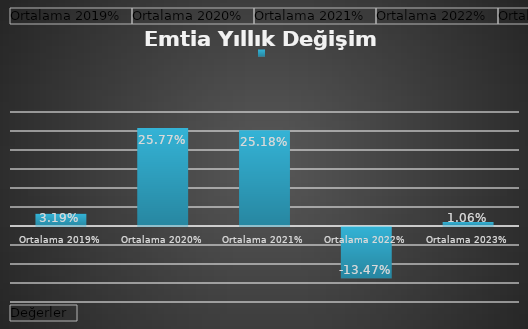
| Category | Toplam |
|---|---|
| Ortalama 2019% | 0.032 |
| Ortalama 2020% | 0.258 |
| Ortalama 2021% | 0.252 |
| Ortalama 2022% | -0.135 |
| Ortalama 2023% | 0.011 |